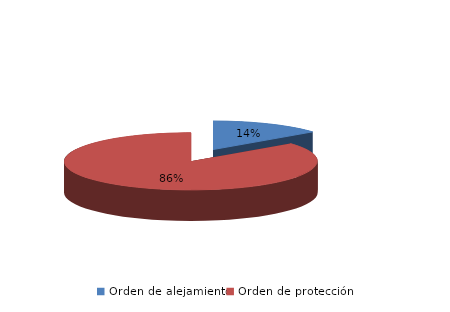
| Category | Series 0 |
|---|---|
| Orden de alejamiento | 32 |
| Orden de protección | 191 |